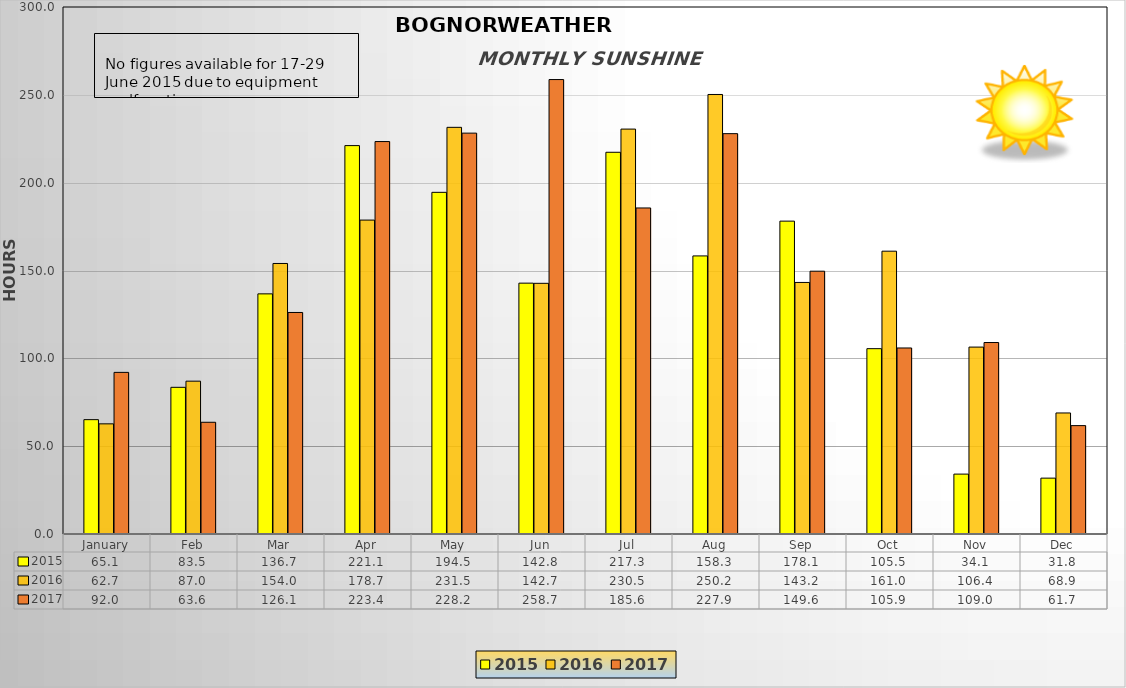
| Category | 2015 | 2016 | 2017 |
|---|---|---|---|
| January | 65.1 | 62.7 | 92 |
| Feb | 83.5 | 87 | 63.6 |
| Mar | 136.7 | 154 | 126.1 |
| Apr | 221.1 | 178.7 | 223.4 |
| May | 194.5 | 231.5 | 228.2 |
| Jun | 142.8 | 142.7 | 258.7 |
| Jul | 217.3 | 230.5 | 185.6 |
| Aug | 158.3 | 250.2 | 227.9 |
| Sep | 178.1 | 143.2 | 149.6 |
| Oct | 105.5 | 161 | 105.9 |
| Nov | 34.1 | 106.4 | 109 |
| Dec | 31.8 | 68.9 | 61.7 |